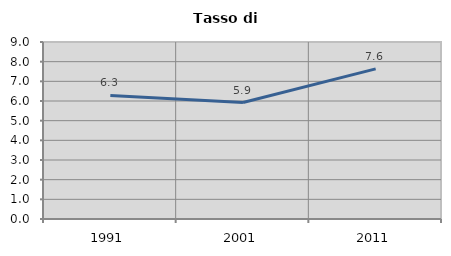
| Category | Tasso di disoccupazione   |
|---|---|
| 1991.0 | 6.28 |
| 2001.0 | 5.92 |
| 2011.0 | 7.632 |